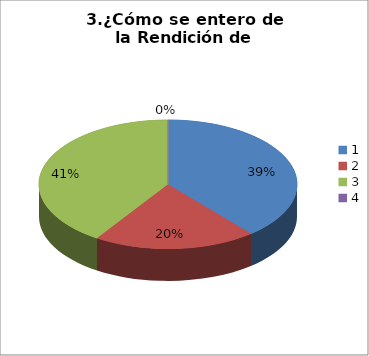
| Category | Series 0 |
|---|---|
| 0 | 21 |
| 1 | 11 |
| 2 | 22 |
| 3 | 0 |